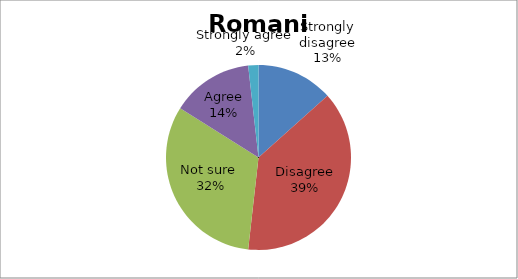
| Category | Series 0 |
|---|---|
| Strongly disagree | 15 |
| Disagree | 43 |
| Not sure  | 36 |
| Agree | 16 |
| Strongly agree | 2 |